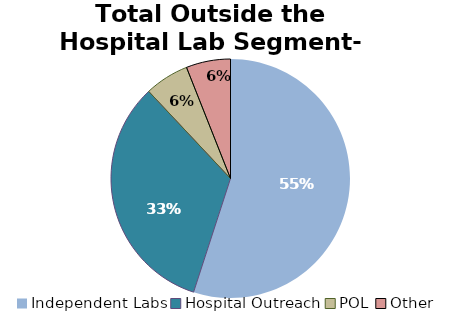
| Category | Series 0 |
|---|---|
| Independent Labs | 0.55 |
| Hospital Outreach | 0.33 |
| POL | 0.06 |
| Other | 0.06 |